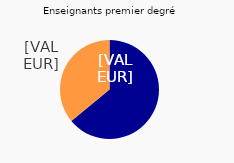
| Category | Enseignants 1er degré | Enseignants 2nd degré | Cadres |
|---|---|---|---|
| Oui | 64 | 57 | 38 |
| Non | 36 | 43 | 62 |